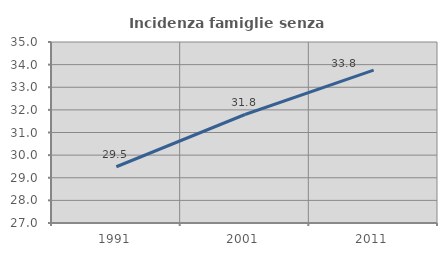
| Category | Incidenza famiglie senza nuclei |
|---|---|
| 1991.0 | 29.486 |
| 2001.0 | 31.795 |
| 2011.0 | 33.754 |